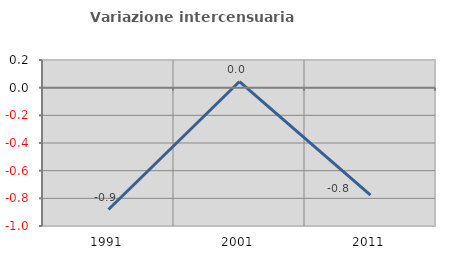
| Category | Variazione intercensuaria annua |
|---|---|
| 1991.0 | -0.881 |
| 2001.0 | 0.044 |
| 2011.0 | -0.777 |